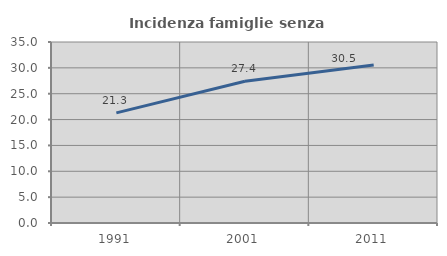
| Category | Incidenza famiglie senza nuclei |
|---|---|
| 1991.0 | 21.3 |
| 2001.0 | 27.403 |
| 2011.0 | 30.544 |